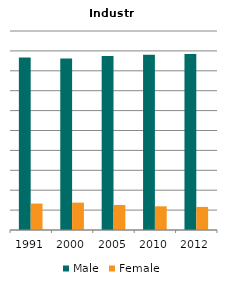
| Category | Male | Female |
|---|---|---|
| 1991.0 | 0.867 | 0.133 |
| 2000.0 | 0.862 | 0.138 |
| 2005.0 | 0.874 | 0.126 |
| 2010.0 | 0.881 | 0.119 |
| 2012.0 | 0.884 | 0.116 |